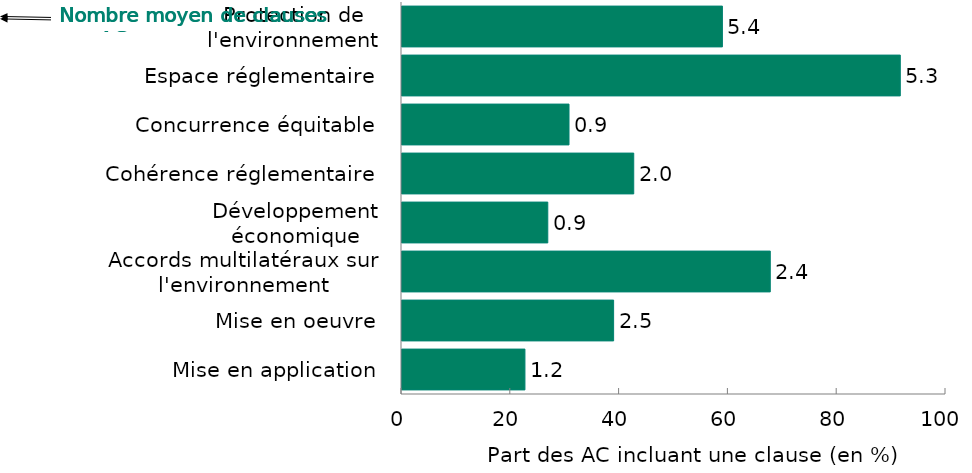
| Category | Part des accords avec au moins une clause dans cette catégorie
(en %) |
|---|---|
| Mise en application | 22.6 |
| Mise en oeuvre | 38.9 |
| Accords multilatéraux sur l'environnement | 67.7 |
| Développement économique | 26.8 |
| Cohérence réglementaire | 42.6 |
| Concurrence équitable | 30.7 |
| Espace réglementaire | 91.6 |
| Protection de l'environnement | 58.9 |